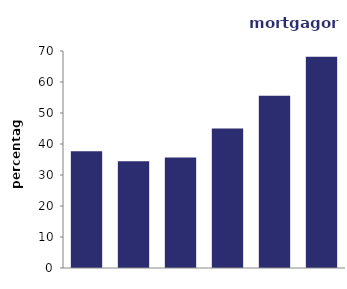
| Category | mortgagors |
|---|---|
| 16-24 | 37.648 |
| 25-34 | 34.454 |
| 35-44 | 35.605 |
| 45-54 | 45.02 |
| 55-64 | 55.531 |
| 65 or over | 68.178 |